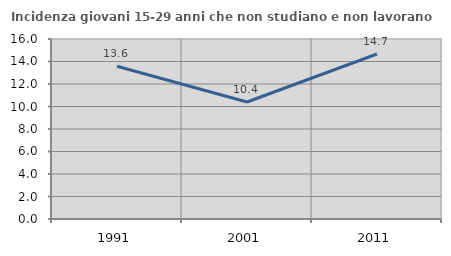
| Category | Incidenza giovani 15-29 anni che non studiano e non lavorano  |
|---|---|
| 1991.0 | 13.573 |
| 2001.0 | 10.399 |
| 2011.0 | 14.669 |